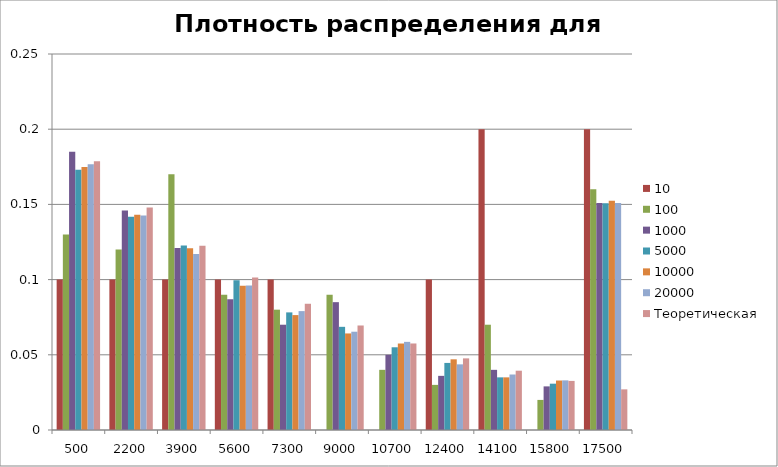
| Category | 10 | 100 | 1000 | 5000 | 10000 | 20000 | Теоретическая |
|---|---|---|---|---|---|---|---|
| 500.0 | 0.1 | 0.13 | 0.185 | 0.173 | 0.175 | 0.177 | 0.179 |
| 2200.0 | 0.1 | 0.12 | 0.146 | 0.142 | 0.143 | 0.143 | 0.148 |
| 3900.0 | 0.1 | 0.17 | 0.121 | 0.123 | 0.121 | 0.117 | 0.122 |
| 5600.0 | 0.1 | 0.09 | 0.087 | 0.1 | 0.096 | 0.096 | 0.101 |
| 7300.0 | 0.1 | 0.08 | 0.07 | 0.078 | 0.076 | 0.079 | 0.084 |
| 9000.0 | 0 | 0.09 | 0.085 | 0.069 | 0.064 | 0.065 | 0.069 |
| 10700.0 | 0 | 0.04 | 0.05 | 0.055 | 0.058 | 0.059 | 0.058 |
| 12400.0 | 0.1 | 0.03 | 0.036 | 0.045 | 0.047 | 0.044 | 0.048 |
| 14100.0 | 0.2 | 0.07 | 0.04 | 0.035 | 0.035 | 0.037 | 0.039 |
| 15800.0 | 0 | 0.02 | 0.029 | 0.031 | 0.033 | 0.033 | 0.033 |
| 17500.0 | 0.2 | 0.16 | 0.151 | 0.151 | 0.152 | 0.151 | 0.027 |